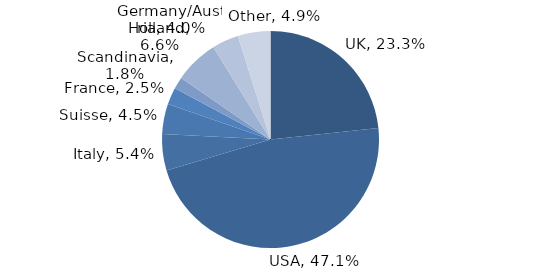
| Category | Investment Style |
|---|---|
| UK | 0.233 |
| USA | 0.471 |
| Italy | 0.054 |
| Suisse | 0.045 |
| France | 0.025 |
| Scandinavia | 0.018 |
| Holland | 0.066 |
| Germany/Austria | 0.04 |
| Other | 0.049 |